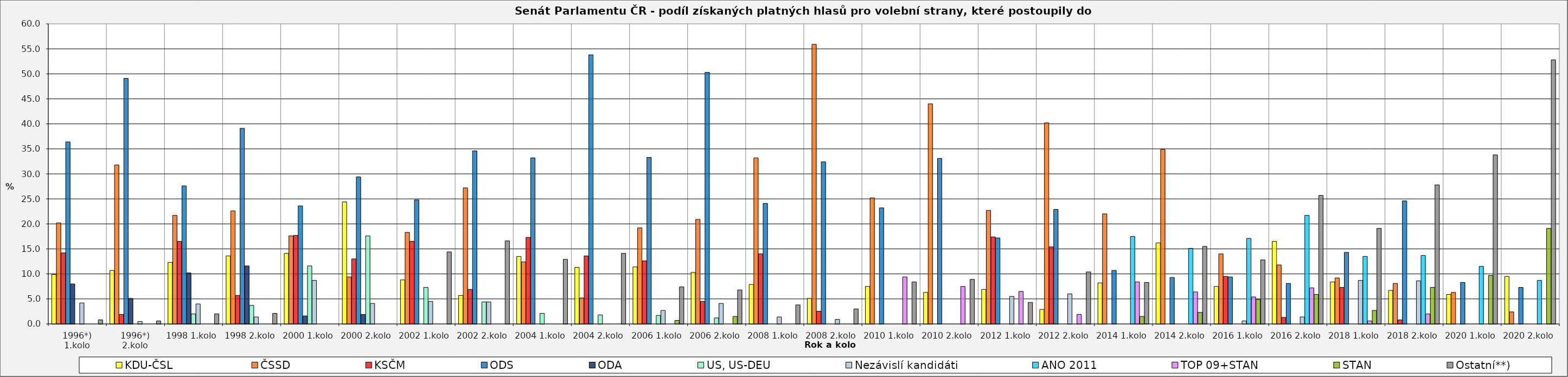
| Category | KDU-ČSL  | ČSSD | KSČM | ODS | ODA | US, US-DEU | Nezávislí kandidáti | ANO 2011 | TOP 09+STAN | STAN | Ostatní**) |
|---|---|---|---|---|---|---|---|---|---|---|---|
| 1996*) 1.kolo | 9.9 | 20.2 | 14.2 | 36.4 | 8 | 0 | 4.2 | 0 | 0 | 0 | 0.8 |
| 1996*) 2.kolo | 10.7 | 31.8 | 1.9 | 49.1 | 5.1 | 0 | 0.5 | 0 | 0 | 0 | 0.6 |
| 1998 1.kolo | 12.3 | 21.7 | 16.5 | 27.6 | 10.2 | 2 | 4 | 0 | 0 | 0 | 2 |
| 1998 2.kolo | 13.6 | 22.6 | 5.7 | 39.1 | 11.6 | 3.7 | 1.4 | 0 | 0 | 0 | 2.1 |
| 2000 1.kolo | 14.1 | 17.6 | 17.7 | 23.6 | 1.6 | 11.6 | 8.7 | 0 | 0 | 0 | 0 |
| 2000 2.kolo | 24.4 | 9.4 | 13 | 29.4 | 1.9 | 17.6 | 4.1 | 0 | 0 | 0 | 0 |
| 2002 1.kolo | 8.8 | 18.3 | 16.5 | 24.8 | 0 | 7.3 | 4.5 | 0 | 0 | 0 | 14.4 |
| 2002 2.kolo | 5.7 | 27.2 | 6.9 | 34.6 | 0 | 4.4 | 4.4 | 0 | 0 | 0 | 16.6 |
| 2004 1.kolo | 13.5 | 12.4 | 17.3 | 33.2 | 0 | 2.1 | 0 | 0 | 0 | 0 | 12.9 |
| 2004 2.kolo | 11.3 | 5.2 | 13.6 | 53.8 | 0 | 1.8 | 0 | 0 | 0 | 0 | 14.1 |
| 2006 1.kolo | 11.4 | 19.2 | 12.6 | 33.3 | 0 | 1.7 | 2.7 | 0 | 0 | 0.7 | 7.4 |
| 2006 2.kolo | 10.3 | 20.9 | 4.5 | 50.3 | 0 | 1.2 | 4.1 | 0 | 0 | 1.5 | 6.8 |
| 2008 1.kolo | 7.9 | 33.2 | 14 | 24.1 | 0 | 0 | 1.4 | 0 | 0 | 0 | 3.8 |
| 2008 2.kolo | 5.1 | 55.9 | 2.54 | 32.4 | 0 | 0 | 0.9 | 0 | 0 | 0 | 3 |
| 2010 1.kolo | 7.5 | 25.2 | 0 | 23.2 | 0 | 0 | 0 | 0 | 9.4 | 0 | 8.4 |
| 2010 2.kolo | 6.3 | 44 | 0 | 33.1 | 0 | 0 | 0 | 0 | 7.5 | 0 | 8.9 |
| 2012 1.kolo | 6.9 | 22.7 | 17.4 | 17.2 | 0 | 0 | 5.5 | 0 | 6.5 | 0 | 4.3 |
| 2012 2.kolo | 2.9 | 40.2 | 15.4 | 22.9 | 0 | 0 | 6 | 0 | 1.9 | 0 | 10.4 |
| 2014 1.kolo | 8.2 | 22 | 0 | 10.7 | 0 | 0 | 0 | 17.5 | 8.4 | 1.5 | 8.3 |
| 2014 2.kolo | 16.2 | 34.9 | 0 | 9.3 | 0 | 0 | 0 | 15.1 | 6.4 | 2.3 | 15.5 |
| 2016 1.kolo | 7.5 | 14 | 9.5 | 9.4 | 0 | 0 | 0.6 | 17.1 | 5.4 | 4.9 | 12.8 |
| 2016 2.kolo | 16.5 | 11.8 | 1.3 | 8.1 | 0 | 0 | 1.4 | 21.7 | 7.2 | 5.9 | 25.7 |
| 2018 1.kolo | 8.4 | 9.2 | 7.3 | 14.3 | 0 | 0 | 8.7 | 13.5 | 0.6 | 2.7 | 19.1 |
| 2018 2.kolo | 6.7 | 8.1 | 0.8 | 24.6 | 0 | 0 | 8.6 | 13.7 | 2 | 7.3 | 27.8 |
| 2020 1.kolo | 5.9 | 6.3 | 0 | 8.3 | 0 | 0 | 0 | 11.5 | 0 | 9.7 | 33.8 |
| 2020 2.kolo | 9.5 | 2.4 | 0 | 7.3 | 0 | 0 | 0 | 8.7 | 0 | 19.1 | 52.8 |